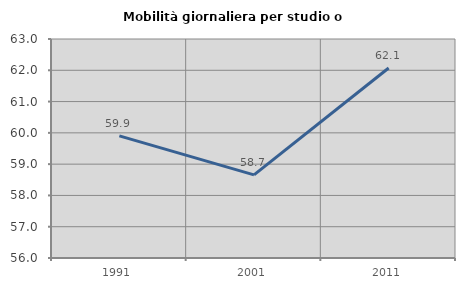
| Category | Mobilità giornaliera per studio o lavoro |
|---|---|
| 1991.0 | 59.902 |
| 2001.0 | 58.657 |
| 2011.0 | 62.075 |